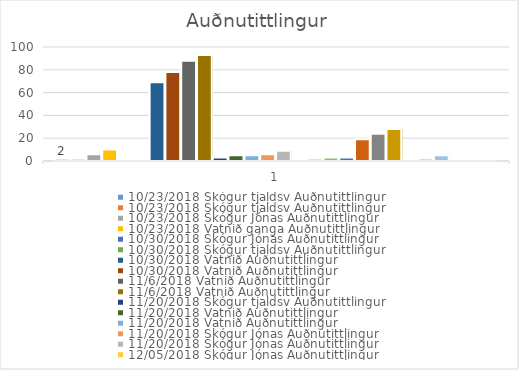
| Category | 23.10.2018 | 30.10.2018 | 6.11.2018 | 20.11.2018 | 12.05.2018 | 12.18.2018 | 5.3.2019 | 08.01.2019 | 23/4/2019 | 30/4/2019 |
|---|---|---|---|---|---|---|---|---|---|---|
| 0 | 10 | 78 | 93 | 9 | 19 | 28 | 1 | 5 | 1 | 1 |